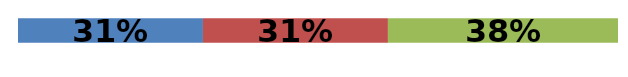
| Category | Series 0 | Series 1 | Series 2 |
|---|---|---|---|
| 0 | 0.308 | 0.308 | 0.383 |